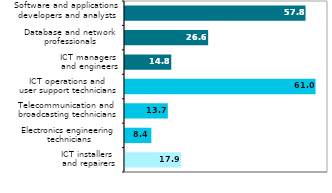
| Category | Series 0 |
|---|---|
| ICT installers 
 and repairers  | 17.886 |
| Electronics engineering
 technicians | 8.441 |
| Telecommunication and
 broadcasting technicians | 13.719 |
| ICT operations and
 user support technicians | 61.02 |
| ICT managers
 and engineers | 14.813 |
| Database and network
 professionals | 26.624 |
| Software and applications
 developers and analysts  | 57.807 |